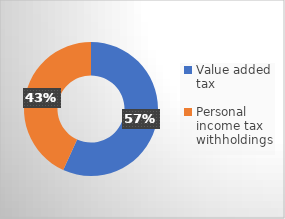
| Category | Taxes Collected |
|---|---|
| Value added tax | 85632 |
| Personal income tax  withholdings | 65114 |